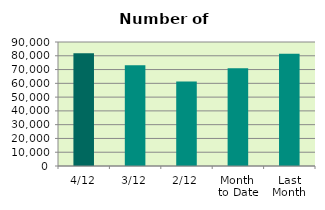
| Category | Series 0 |
|---|---|
| 4/12 | 81826 |
| 3/12 | 73120 |
| 2/12 | 61382 |
| Month 
to Date | 70942.5 |
| Last
Month | 81433.048 |